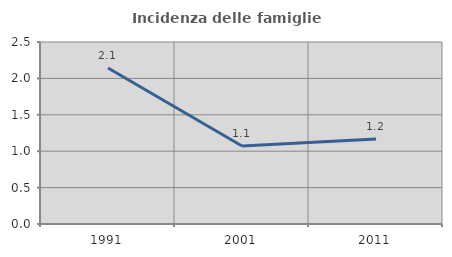
| Category | Incidenza delle famiglie numerose |
|---|---|
| 1991.0 | 2.143 |
| 2001.0 | 1.071 |
| 2011.0 | 1.168 |